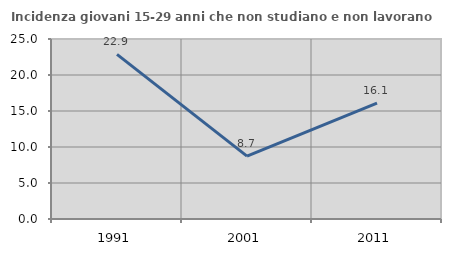
| Category | Incidenza giovani 15-29 anni che non studiano e non lavorano  |
|---|---|
| 1991.0 | 22.868 |
| 2001.0 | 8.739 |
| 2011.0 | 16.103 |